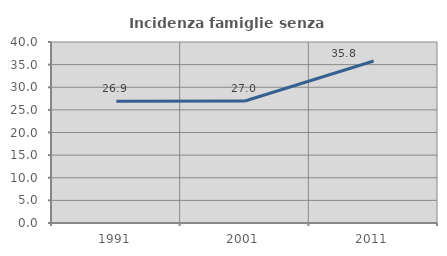
| Category | Incidenza famiglie senza nuclei |
|---|---|
| 1991.0 | 26.895 |
| 2001.0 | 26.962 |
| 2011.0 | 35.812 |